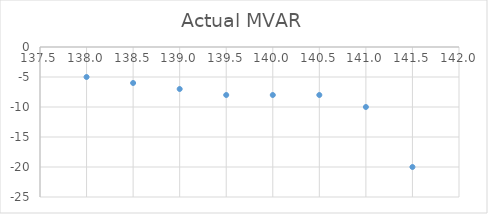
| Category | Actual MVAR |
|---|---|
| 138.0 | -5 |
| 138.5 | -6 |
| 139.0 | -7 |
| 139.5 | -8 |
| 140.0 | -8 |
| 140.5 | -8 |
| 141.0 | -10 |
| 141.5 | -20 |